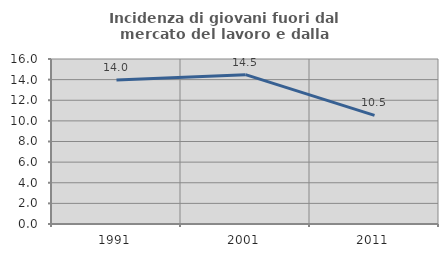
| Category | Incidenza di giovani fuori dal mercato del lavoro e dalla formazione  |
|---|---|
| 1991.0 | 13.975 |
| 2001.0 | 14.481 |
| 2011.0 | 10.528 |